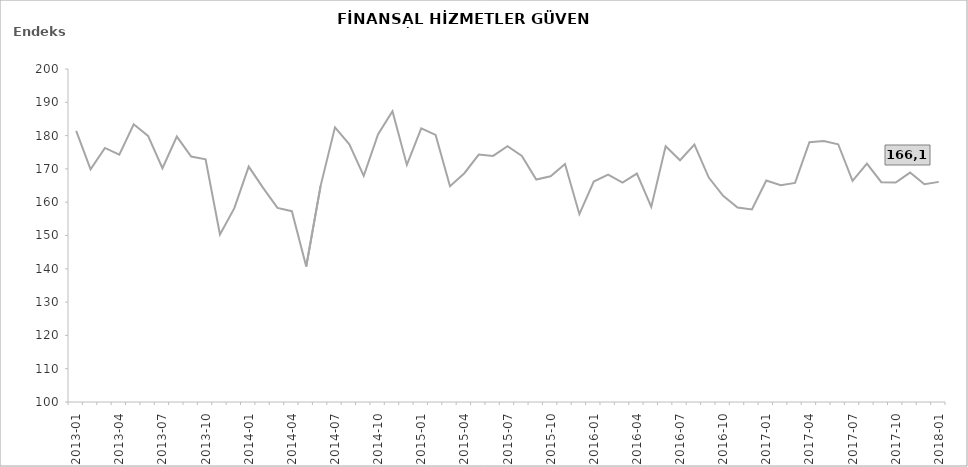
| Category | FHGE |
|---|---|
| 2013-01 | 181.4 |
|  | 169.9 |
|  | 176.3 |
| 2013-04 | 174.3 |
|  | 183.4 |
|  | 179.9 |
| 2013-07 | 170.2 |
|  | 179.7 |
|  | 173.7 |
| 2013-10 | 172.9 |
|  | 150.3 |
|  | 158.2 |
| 2014-01 | 170.7 |
|  | 164.3 |
|  | 158.3 |
| 2014-04 | 157.3 |
|  | 140.7 |
|  | 164.9 |
| 2014-07 | 182.5 |
|  | 177.4 |
|  | 167.9 |
| 2014-10 | 180.4 |
|  | 187.3 |
|  | 171.2 |
| 2015-01 | 182.2 |
|  | 180.2 |
|  | 164.8 |
| 2015-04 | 168.7 |
|  | 174.3 |
|  | 173.9 |
| 2015-07 | 176.8 |
|  | 173.9 |
|  | 166.8 |
| 2015-10 | 167.8 |
|  | 171.5 |
|  | 156.4 |
| 2016-01 | 166.2 |
|  | 168.3 |
|  | 165.9 |
| 2016-04 | 168.6 |
|  | 158.6 |
|  | 176.8 |
| 2016-07 | 172.6 |
|  | 177.3 |
|  | 167.4 |
| 2016-10 | 161.9 |
|  | 158.4 |
|  | 157.8 |
| 2017-01 | 166.5 |
|  | 165.1 |
|  | 165.8 |
| 2017-04 | 178 |
|  | 178.4 |
|  | 177.4 |
| 2017-07 | 166.4 |
|  | 171.6 |
|  | 166 |
| 2017-10 | 165.9 |
|  | 168.9 |
|  | 165.4 |
| 2018-01 | 166.1 |